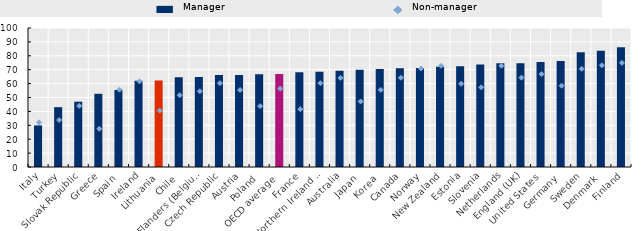
| Category | Manager |
|---|---|
| Italy | 29.943 |
| Turkey | 43.04 |
| Slovak Republic | 47.002 |
| Greece | 52.659 |
| Spain | 55.398 |
| Ireland | 62.063 |
| Lithuania | 62.259 |
| Chile | 64.585 |
| Flanders (Belgium) | 64.817 |
| Czech Republic | 66.116 |
| Austria | 66.131 |
| Poland | 66.697 |
| OECD average | 66.926 |
| France | 68.147 |
| Northern Ireland (UK) | 68.525 |
| Australia | 69.285 |
| Japan | 69.941 |
| Korea | 70.591 |
| Canada | 70.973 |
| Norway | 71.273 |
| New Zealand | 72.137 |
| Estonia | 72.405 |
| Slovenia | 73.67 |
| Netherlands | 74.632 |
| England (UK) | 74.73 |
| United States | 75.497 |
| Germany | 76.245 |
| Sweden | 82.638 |
| Denmark | 83.65 |
| Finland | 86.213 |